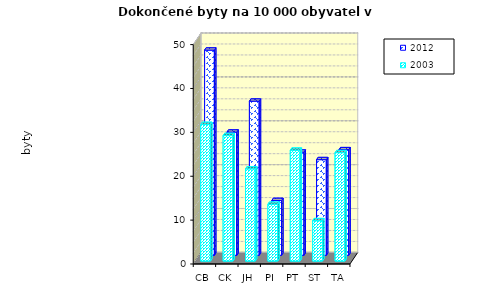
| Category | 2012 | 2003 |
|---|---|---|
| CB | 46.749 | 31.131 |
| CK | 28.062 | 28.597 |
| JH | 35.115 | 21.012 |
| PI | 12.475 | 12.946 |
| PT | 23.5 | 25.261 |
| ST | 21.785 | 9.198 |
| TA | 24.048 | 24.7 |